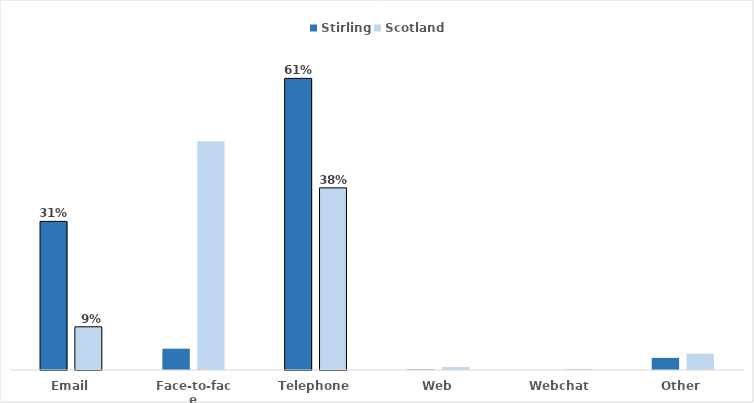
| Category | Stirling | Scotland |
|---|---|---|
| Email | 0.313 | 0.091 |
| Face-to-face | 0.045 | 0.482 |
| Telephone | 0.615 | 0.384 |
| Web | 0.001 | 0.006 |
| Webchat | 0 | 0.002 |
| Other | 0.026 | 0.034 |